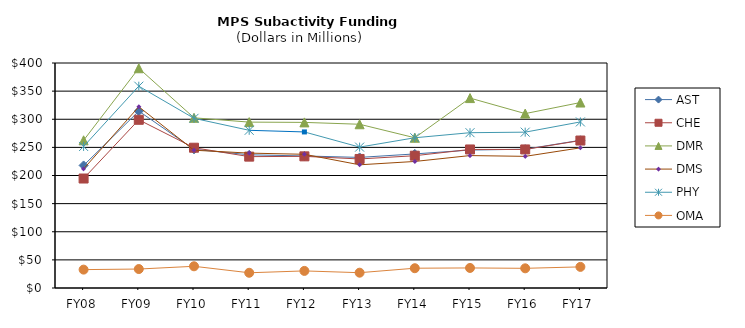
| Category | AST | CHE | DMR | DMS | PHY | OMA |
|---|---|---|---|---|---|---|
| FY08 | 217.901 | 194.623 | 262.547 | 211.752 | 251.639 | 32.671 |
| FY09 | 314.473 | 299.029 | 390.694 | 322.181 | 358.771 | 33.702 |
| FY10 | 246.53 | 249.383 | 302.575 | 244.919 | 301.66 | 38.584 |
| FY11 | 236.784 | 233.548 | 294.906 | 239.786 | 280.338 | 27.061 |
| FY12 | 234.724 | 234.028 | 294.404 | 237.722 | 277.444 | 30.374 |
| FY13 | 232.17 | 229.39 | 291.09 | 219.02 | 250.45 | 27.22 |
| FY14 | 238.36 | 235.18 | 267.09 | 224.97 | 267.09 | 35.17 |
| FY15 | 245.23 | 246.29 | 337.62 | 235.43 | 276.1 | 35.65 |
| FY16 | 246.73 | 246.31 | 310.03 | 234.05 | 277.03 | 35 |
| FY17 | 262.61 | 262.16 | 329.71 | 249.17 | 295.26 | 37.54 |